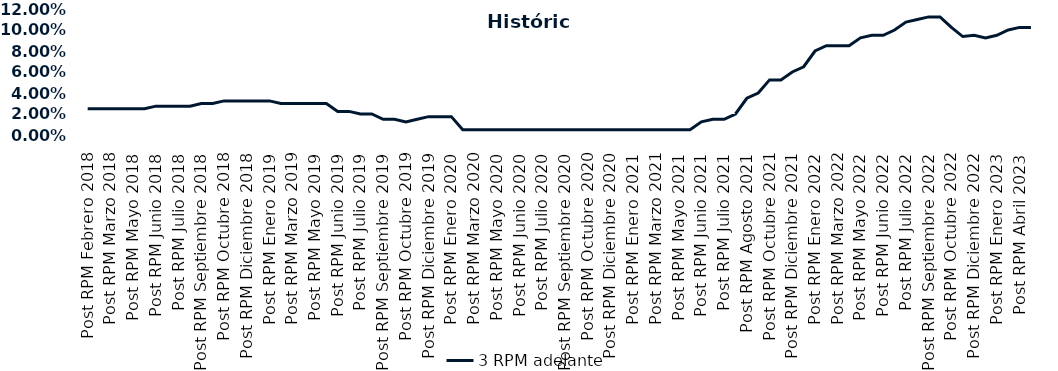
| Category | 3 RPM adelante |
|---|---|
| Post RPM Febrero 2018 | 0.025 |
| Pre RPM Marzo 2018 | 0.025 |
| Post RPM Marzo 2018 | 0.025 |
| Pre RPM Mayo 2018 | 0.025 |
| Post RPM Mayo 2018 | 0.025 |
| Pre RPM Junio 2018 | 0.025 |
| Post RPM Junio 2018 | 0.028 |
| Pre RPM Julio 2018 | 0.028 |
| Post RPM Julio 2018 | 0.028 |
| Pre RPM Septiembre 2018 | 0.028 |
| Post RPM Septiembre 2018 | 0.03 |
| Pre RPM Octubre 2018 | 0.03 |
| Post RPM Octubre 2018 | 0.032 |
| Pre RPM Diciembre 2018 | 0.032 |
| Post RPM Diciembre 2018 | 0.032 |
| Pre RPM Enero 2019 | 0.032 |
| Post RPM Enero 2019 | 0.032 |
| Pre RPM Marzo 2019 | 0.03 |
| Post RPM Marzo 2019 | 0.03 |
| Pre RPM Mayo 2019 | 0.03 |
| Post RPM Mayo 2019 | 0.03 |
| Pre RPM Junio 2019 | 0.03 |
| Post RPM Junio 2019 | 0.022 |
| Pre RPM Julio 2019 | 0.022 |
| Post RPM Julio 2019 | 0.02 |
| Pre RPM Septiembre 2019 | 0.02 |
| Post RPM Septiembre 2019 | 0.015 |
| Pre RPM Octubre 2019 | 0.015 |
| Post RPM Octubre 2019 | 0.012 |
| Pre RPM Diciembre 2019 | 0.015 |
| Post RPM Diciembre 2019 | 0.018 |
| Pre RPM Enero 2020 | 0.018 |
| Post RPM Enero 2020 | 0.018 |
| Pre RPM Marzo 2020 | 0.005 |
| Post RPM Marzo 2020 | 0.005 |
| Pre RPM Mayo 2020 | 0.005 |
| Post RPM Mayo 2020 | 0.005 |
| Pre RPM Junio 2020 | 0.005 |
| Post RPM Junio 2020 | 0.005 |
| Pre RPM Julio 2020 | 0.005 |
| Post RPM Julio 2020 | 0.005 |
| Pre RPM Septiembre 2020 | 0.005 |
| Post RPM Septiembre 2020 | 0.005 |
| Pre RPM Octubre 2020 | 0.005 |
| Post RPM Octubre 2020 | 0.005 |
| Pre RPM Diciembre 2020 | 0.005 |
| Post RPM Diciembre 2020 | 0.005 |
| Pre RPM Enero 2021 | 0.005 |
| Post RPM Enero 2021 | 0.005 |
| Pre RPM Marzo 2021 | 0.005 |
| Post RPM Marzo 2021 | 0.005 |
| Pre RPM Mayo 2021 | 0.005 |
| Post RPM Mayo 2021 | 0.005 |
| Pre RPM Junio 2021 | 0.005 |
| Post RPM Junio 2021 | 0.012 |
| Pre RPM Julio 2021 | 0.015 |
| Post RPM Julio 2021 | 0.015 |
| Pre RPM Agosto 2021 | 0.02 |
| Post RPM Agosto 2021 | 0.035 |
| Pre RPM Octubre 2021 | 0.04 |
| Post RPM Octubre 2021 | 0.052 |
| Pre RPM Diciembre 2021 | 0.052 |
| Post RPM Diciembre 2021 | 0.06 |
| Pre RPM Enero 2022 | 0.065 |
| Post RPM Enero 2022 | 0.08 |
| Pre RPM Marzo 2022 | 0.085 |
| Post RPM Marzo 2022 | 0.085 |
| Pre RPM Mayo 2022 | 0.085 |
| Post RPM Mayo 2022 | 0.092 |
| Pre RPM Junio 2022 | 0.095 |
| Post RPM Junio 2022 | 0.095 |
| Pre RPM Julio 2022 | 0.1 |
| Post RPM Julio 2022 | 0.108 |
| Pre RPM Septiembre 2022 | 0.11 |
| Post RPM Septiembre 2022 | 0.112 |
| Pre RPM Octubre 2022 | 0.112 |
| Post RPM Octubre 2022 | 0.102 |
| Pre RPM Diciembre 2022 | 0.094 |
| Post RPM Diciembre 2022 | 0.095 |
| Pre RPM Enero 2023 | 0.092 |
| Post RPM Enero 2023 | 0.095 |
| Pre RPM Abril 2023 | 0.1 |
| Post RPM Abril 2023 | 0.102 |
| Pre RPM Mayo 2023 | 0.102 |